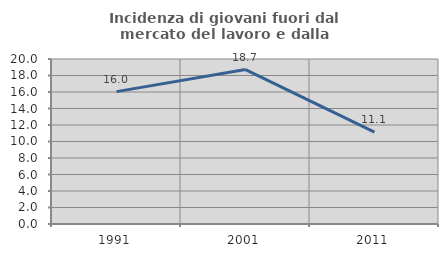
| Category | Incidenza di giovani fuori dal mercato del lavoro e dalla formazione  |
|---|---|
| 1991.0 | 16.047 |
| 2001.0 | 18.724 |
| 2011.0 | 11.14 |